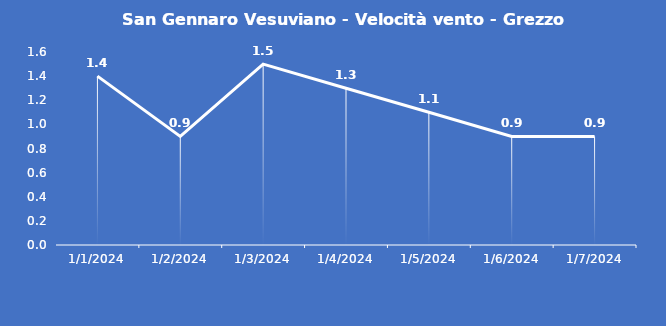
| Category | San Gennaro Vesuviano - Velocità vento - Grezzo (m/s) |
|---|---|
| 1/1/24 | 1.4 |
| 1/2/24 | 0.9 |
| 1/3/24 | 1.5 |
| 1/4/24 | 1.3 |
| 1/5/24 | 1.1 |
| 1/6/24 | 0.9 |
| 1/7/24 | 0.9 |